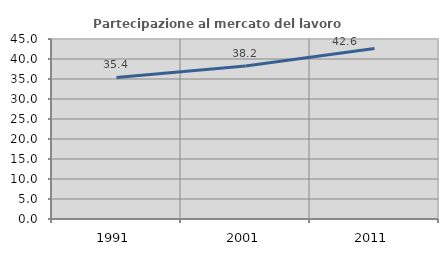
| Category | Partecipazione al mercato del lavoro  femminile |
|---|---|
| 1991.0 | 35.38 |
| 2001.0 | 38.227 |
| 2011.0 | 42.611 |